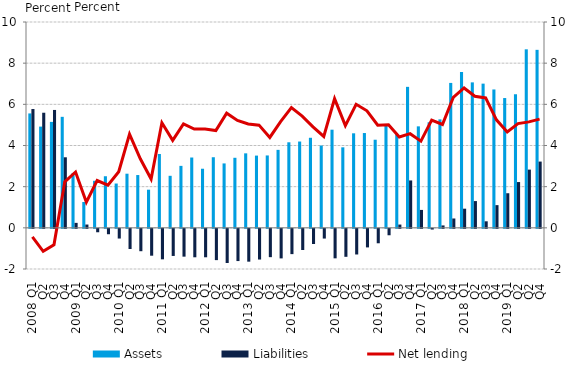
| Category | Assets | Liabilities |
|---|---|---|
| 2008 Q1 | 5.558 | 5.772 |
| Q2 | 4.918 | 5.592 |
| Q3 | 5.147 | 5.727 |
| Q4 | 5.393 | 3.427 |
| 2009 Q1 | 2.652 | 0.241 |
| Q2 | 1.254 | 0.16 |
| Q3 | 2.285 | -0.167 |
| Q4 | 2.507 | -0.263 |
| 2010 Q1 | 2.153 | -0.472 |
| Q2 | 2.63 | -0.981 |
| Q3 | 2.565 | -1.087 |
| Q4 | 1.853 | -1.305 |
| 2011 Q1 | 3.587 | -1.482 |
| Q2 | 2.528 | -1.317 |
| Q3 | 3.01 | -1.351 |
| Q4 | 3.417 | -1.382 |
| 2012 Q1 | 2.871 | -1.382 |
| Q2 | 3.43 | -1.52 |
| Q3 | 3.129 | -1.66 |
| Q4 | 3.403 | -1.566 |
| 2013 Q1 | 3.619 | -1.595 |
| Q2 | 3.51 | -1.492 |
| Q3 | 3.517 | -1.376 |
| Q4 | 3.788 | -1.436 |
| 2014 Q1 | 4.156 | -1.229 |
| Q2 | 4.193 | -1.029 |
| Q3 | 4.375 | -0.737 |
| Q4 | 3.999 | -0.473 |
| 2015 Q1 | 4.768 | -1.433 |
| Q2 | 3.911 | -1.359 |
| Q3 | 4.593 | -1.246 |
| Q4 | 4.606 | -0.902 |
| 2016 Q1 | 4.281 | -0.702 |
| Q2 | 4.985 | -0.313 |
| Q3 | 4.546 | 0.159 |
| Q4 | 6.85 | 2.302 |
| 2017 Q1 | 4.93 | 0.87 |
| Q2 | 5.128 | -0.035 |
| Q3 | 5.269 | 0.117 |
| Q4 | 7.04 | 0.454 |
| 2018 Q1 | 7.569 | 0.93 |
| Q2 | 7.067 | 1.3 |
| Q3 | 7.006 | 0.317 |
| Q4 | 6.723 | 1.103 |
| 2019 Q1 | 6.305 | 1.681 |
| Q2 | 6.494 | 2.224 |
| Q2 | 8.673 | 2.828 |
| Q4 | 8.647 | 3.219 |